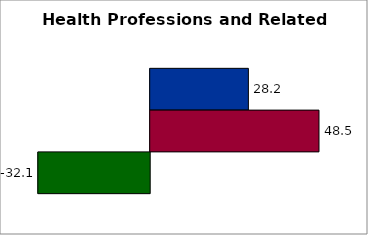
| Category | 50 states and D.C. | SREB states | State |
|---|---|---|---|
| 0 | 28.212 | 48.505 | -32.143 |